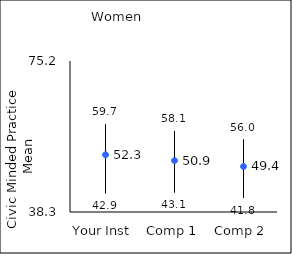
| Category | 25th percentile | 75th percentile | Mean |
|---|---|---|---|
| Your Inst | 42.9 | 59.7 | 52.28 |
| Comp 1 | 43.1 | 58.1 | 50.86 |
| Comp 2 | 41.8 | 56 | 49.42 |